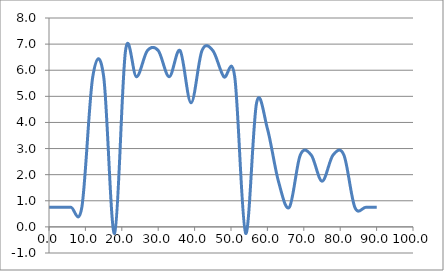
| Category | Elevation (in.) |
|---|---|
| 0.024 | 0.75 |
| 3.024 | 0.75 |
| 6.024 | 0.75 |
| 9.024000000000001 | 0.75 |
| 12.024000000000001 | 5.75 |
| 15.024000000000001 | 5.75 |
| 18.024 | -0.25 |
| 21.024 | 6.75 |
| 24.023999999999997 | 5.75 |
| 27.023999999999997 | 6.75 |
| 30.023999999999997 | 6.75 |
| 33.024 | 5.75 |
| 36.024 | 6.75 |
| 39.024 | 4.75 |
| 42.024 | 6.75 |
| 45.024 | 6.75 |
| 48.024 | 5.75 |
| 51.024 | 5.75 |
| 54.024 | -0.25 |
| 57.024 | 4.75 |
| 60.024 | 3.75 |
| 63.024 | 1.75 |
| 66.024 | 0.75 |
| 69.024 | 2.75 |
| 72.048 | 2.75 |
| 75.024 | 1.75 |
| 78.024 | 2.75 |
| 81.024 | 2.75 |
| 84.024 | 0.75 |
| 87.024 | 0.75 |
| 90.024 | 0.75 |